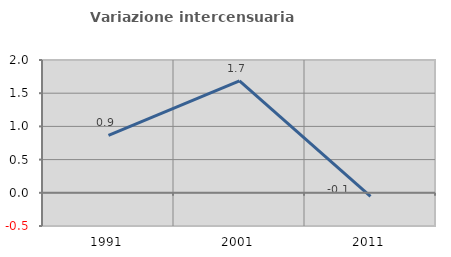
| Category | Variazione intercensuaria annua |
|---|---|
| 1991.0 | 0.864 |
| 2001.0 | 1.685 |
| 2011.0 | -0.054 |